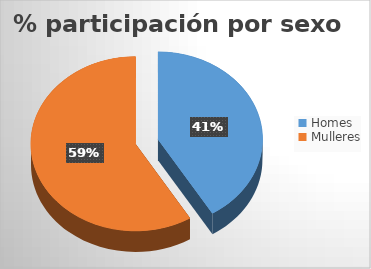
| Category | Series 0 |
|---|---|
| Homes | 59 |
| Mulleres | 84 |